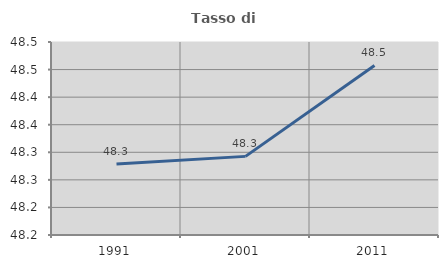
| Category | Tasso di occupazione   |
|---|---|
| 1991.0 | 48.279 |
| 2001.0 | 48.293 |
| 2011.0 | 48.457 |